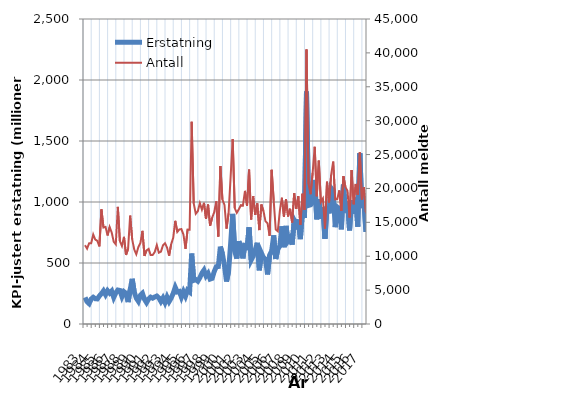
| Category | Erstatning |
|---|---|
| 1983.0 | 217.738 |
| nan | 182.39 |
| nan | 166.795 |
| nan | 204.317 |
| 1984.0 | 219.095 |
| nan | 207.248 |
| nan | 205.483 |
| nan | 229.834 |
| 1985.0 | 248.366 |
| nan | 271.471 |
| nan | 240.555 |
| nan | 272.822 |
| 1986.0 | 252.948 |
| nan | 270.665 |
| nan | 217.848 |
| nan | 254.933 |
| 1987.0 | 278.509 |
| nan | 274.837 |
| nan | 224.911 |
| nan | 264.614 |
| 1988.0 | 251.86 |
| nan | 179.537 |
| nan | 279.633 |
| nan | 370.436 |
| 1989.0 | 261.704 |
| nan | 211.52 |
| nan | 186.12 |
| nan | 234.811 |
| 1990.0 | 251.421 |
| nan | 202.269 |
| nan | 175.421 |
| nan | 204.183 |
| 1991.0 | 220.333 |
| nan | 211.849 |
| nan | 221.715 |
| nan | 229.225 |
| 1992.0 | 214.139 |
| nan | 184.514 |
| nan | 213.2 |
| nan | 175.933 |
| 1993.0 | 220.747 |
| nan | 183.711 |
| nan | 212.245 |
| nan | 251.093 |
| 1994.0 | 300.738 |
| nan | 262.914 |
| nan | 267.117 |
| nan | 220.171 |
| 1995.0 | 265.26 |
| nan | 228.202 |
| nan | 277.29 |
| nan | 263.273 |
| 1996.0 | 577.355 |
| nan | 357.508 |
| nan | 363.895 |
| nan | 350.948 |
| 1997.0 | 379.933 |
| nan | 416.911 |
| nan | 441.514 |
| nan | 393.933 |
| 1998.0 | 415.589 |
| nan | 368.173 |
| nan | 374.188 |
| nan | 430.086 |
| 1999.0 | 469.101 |
| nan | 471.379 |
| nan | 634.301 |
| nan | 574.443 |
| 2000.0 | 478.837 |
| nan | 347.74 |
| nan | 431.1 |
| nan | 657.294 |
| 2001.0 | 902.061 |
| nan | 597.168 |
| nan | 536.336 |
| nan | 678.575 |
| 2002.0 | 618.016 |
| nan | 537.735 |
| nan | 664.547 |
| nan | 605.551 |
| 2003.0 | 791.978 |
| nan | 523.627 |
| nan | 557.072 |
| nan | 606.848 |
| 2004.0 | 665.746 |
| nan | 440.146 |
| nan | 581.891 |
| nan | 543.889 |
| 2005.0 | 532.334 |
| nan | 406.244 |
| nan | 563.978 |
| nan | 597.674 |
| 2006.0 | 726.484 |
| nan | 532.776 |
| nan | 613.024 |
| nan | 639.554 |
| 2007.0 | 800.528 |
| nan | 629.384 |
| nan | 804.144 |
| nan | 679.889 |
| 2008.0 | 703.094 |
| nan | 650.888 |
| nan | 850.097 |
| nan | 816.43 |
| 2009.0 | 856.753 |
| nan | 695.547 |
| nan | 918.799 |
| nan | 868.457 |
| 2010.0 | 1905.043 |
| nan | 971.666 |
| nan | 976.341 |
| nan | 998.838 |
| 2011.0 | 1180.444 |
| nan | 858.391 |
| nan | 1023.5 |
| nan | 862.569 |
| 2012.0 | 955.608 |
| nan | 698.637 |
| nan | 963.225 |
| nan | 906.967 |
| 2013.0 | 1113.851 |
| nan | 1090.67 |
| nan | 793.622 |
| nan | 958.603 |
| 2014.0 | 945.44 |
| nan | 776.393 |
| nan | 1142.115 |
| nan | 913.19 |
| 2015.0 | 1001.888 |
| nan | 767.27 |
| nan | 1015.647 |
| nan | 901.778 |
| 2016.0 | 1036.665 |
| nan | 797.959 |
| nan | 1399.479 |
| nan | 949.547 |
| 2017.0 | 1017.901 |
| nan | 754.952 |